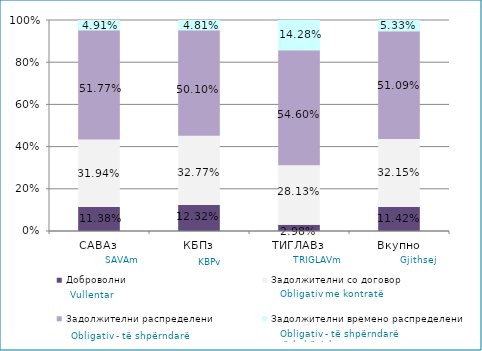
| Category | Доброволни  | Задолжителни со договор  | Задолжителни распределени  | Задолжителни времено распределени  |
|---|---|---|---|---|
| САВАз | 0.114 | 0.319 | 0.518 | 0.049 |
| КБПз | 0.123 | 0.328 | 0.501 | 0.048 |
| ТИГЛАВз | 0.03 | 0.281 | 0.546 | 0.143 |
| Вкупно | 0.114 | 0.322 | 0.511 | 0.053 |